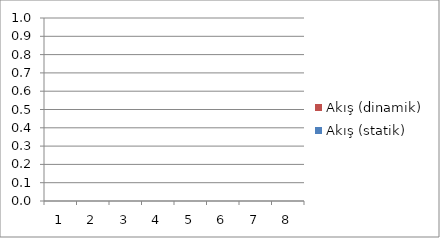
| Category | Akış (dinamik) | Akış (statik) |
|---|---|---|
| 1.0 | 0 | 0 |
| 2.0 | 0 | 0 |
| 3.0 | 0 | 0 |
| 4.0 | 0 | 0 |
| 5.0 | 0 | 0 |
| 6.0 | 0 | 0 |
| 7.0 | 0 | 0 |
| 8.0 | 0 | 0 |